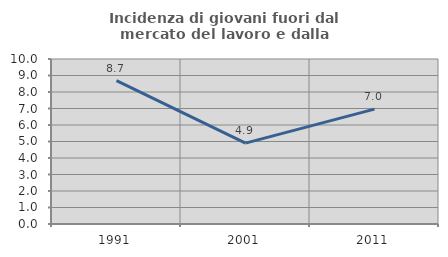
| Category | Incidenza di giovani fuori dal mercato del lavoro e dalla formazione  |
|---|---|
| 1991.0 | 8.688 |
| 2001.0 | 4.901 |
| 2011.0 | 6.965 |